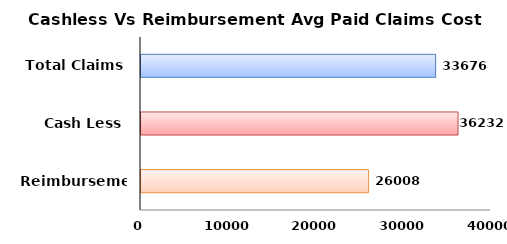
| Category | Series 0 |
|---|---|
| Reimbursement | 26008 |
| Cash Less | 36231.518 |
| Total Claims | 33675.638 |